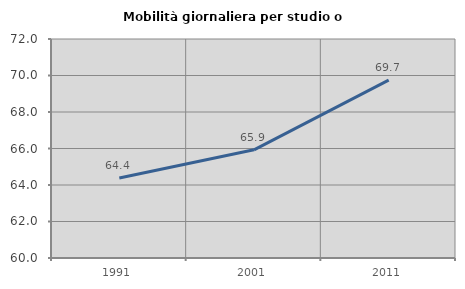
| Category | Mobilità giornaliera per studio o lavoro |
|---|---|
| 1991.0 | 64.385 |
| 2001.0 | 65.927 |
| 2011.0 | 69.743 |